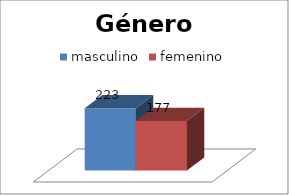
| Category | masculino | femenino |
|---|---|---|
| 0 | 223 | 177 |